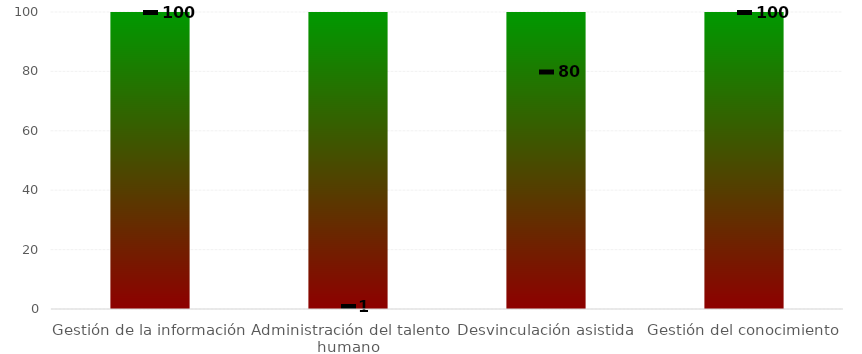
| Category | Niveles |
|---|---|
| Gestión de la información | 100 |
| Administración del talento humano | 100 |
| Desvinculación asistida | 100 |
| Gestión del conocimiento | 100 |